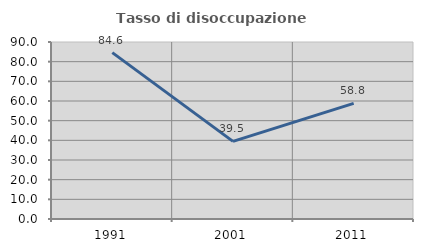
| Category | Tasso di disoccupazione giovanile  |
|---|---|
| 1991.0 | 84.615 |
| 2001.0 | 39.474 |
| 2011.0 | 58.824 |